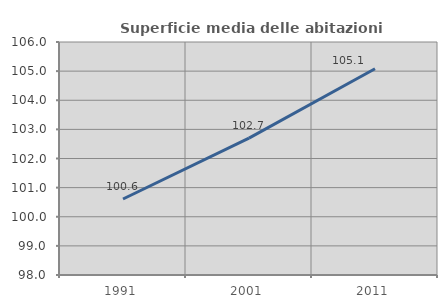
| Category | Superficie media delle abitazioni occupate |
|---|---|
| 1991.0 | 100.61 |
| 2001.0 | 102.699 |
| 2011.0 | 105.08 |